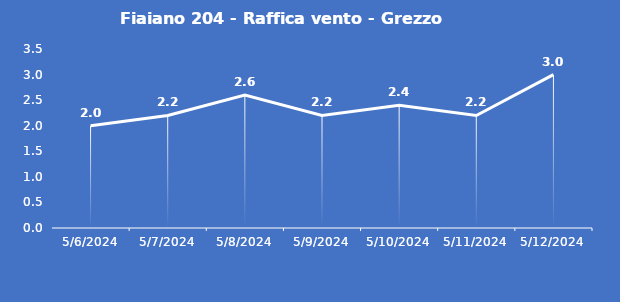
| Category | Fiaiano 204 - Raffica vento - Grezzo (m/s) |
|---|---|
| 5/6/24 | 2 |
| 5/7/24 | 2.2 |
| 5/8/24 | 2.6 |
| 5/9/24 | 2.2 |
| 5/10/24 | 2.4 |
| 5/11/24 | 2.2 |
| 5/12/24 | 3 |